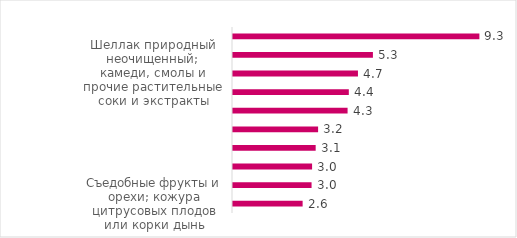
| Category | Изменение доходов (во … раз) |
|---|---|
| Съедобные фрукты и орехи; кожура цитрусовых плодов или корки дынь | 2.637 |
| Сахар и кондитерские изделия из сахара | 2.976 |
| Рыба и ракообразные, моллюски и прочие водные беспозвоночные​ | 2.996 |
| Продукция мукомольно-крупяной промышленности; солод; крахмалы; инулин; пшеничная клейковина | 3.131 |
| Овощи и некоторые съедобные корнеплоды и клубнеплоды​ | 3.223 |
| Злаки | 4.34 |
| Масличные семена и плоды; прочие семена, плоды и зерно; лекарственные растения и растения для технических целей; солома и фураж | 4.387 |
| Шеллак природный неочищенный; камеди, смолы и прочие растительные соки и экстракты | 4.733 |
| Живые животные | 5.3 |
| Мясо и пищевые мясные субпродукты | 9.333 |